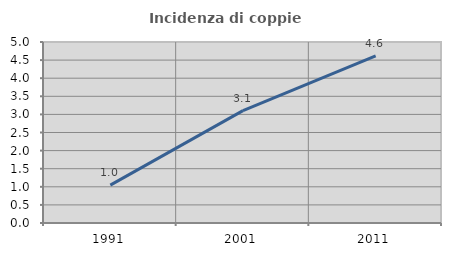
| Category | Incidenza di coppie miste |
|---|---|
| 1991.0 | 1.045 |
| 2001.0 | 3.105 |
| 2011.0 | 4.617 |